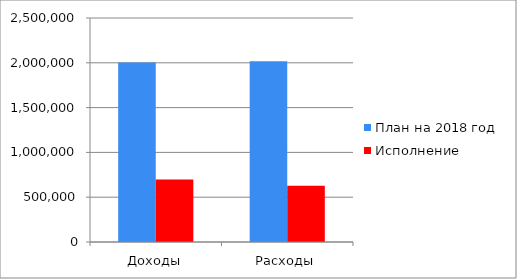
| Category | План на 2018 год | Исполнение |
|---|---|---|
| Доходы | 2002708.8 | 696534.2 |
| Расходы | 2016238 | 627209.5 |